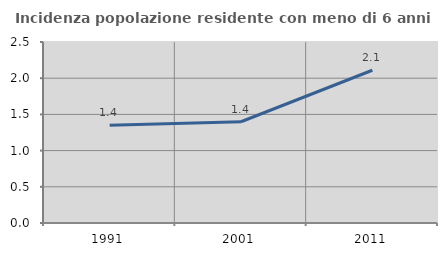
| Category | Incidenza popolazione residente con meno di 6 anni |
|---|---|
| 1991.0 | 1.351 |
| 2001.0 | 1.399 |
| 2011.0 | 2.11 |